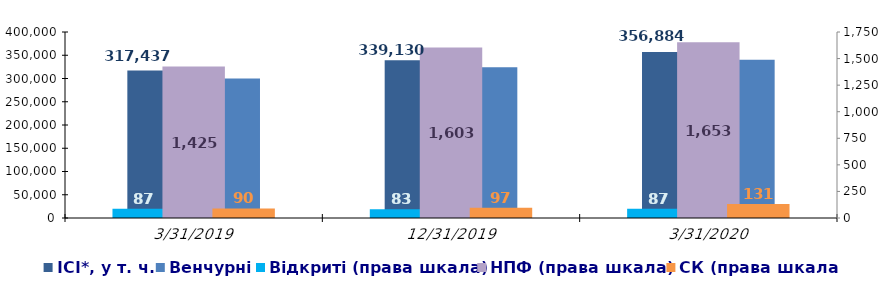
| Category | ІСІ*, у т. ч. | Венчурні |
|---|---|---|
| 3/31/19 | 317437.48 | 300241.73 |
| 12/31/19 | 339129.8 | 324105 |
| 3/31/20 | 356884.27 | 340549.47 |